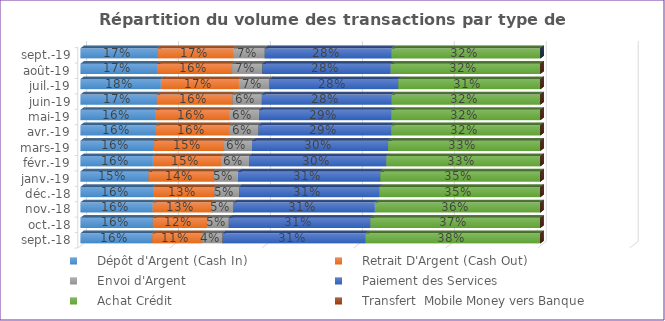
| Category |     Dépôt d'Argent (Cash In) |     Retrait D'Argent (Cash Out)  |     Envoi d'Argent  |     Réception d'Argent |     Paiement des Services |     Achat Crédit |     Transfert Banque vers Mobile Money |     Transfert  Mobile Money vers Banque  |
|---|---|---|---|---|---|---|---|---|
| 2018-09-01 | 0.156 | 0.109 | 0.044 | 0 | 0.311 | 0.379 | 0 | 0 |
| 2018-10-01 | 0.158 | 0.119 | 0.046 | 0 | 0.308 | 0.369 | 0 | 0 |
| 2018-11-01 | 0.157 | 0.129 | 0.047 | 0 | 0.307 | 0.359 | 0 | 0 |
| 2018-12-01 | 0.158 | 0.133 | 0.054 | 0 | 0.305 | 0.349 | 0 | 0 |
| 2019-01-01 | 0.148 | 0.141 | 0.054 | 0 | 0.31 | 0.348 | 0 | 0 |
| 2019-02-01 | 0.158 | 0.15 | 0.059 | 0 | 0.299 | 0.334 | 0 | 0 |
| 2019-03-01 | 0.159 | 0.153 | 0.061 | 0 | 0.296 | 0.331 | 0 | 0 |
| 2019-04-01 | 0.164 | 0.16 | 0.062 | 0 | 0.289 | 0.324 | 0 | 0 |
| 2019-05-01 | 0.164 | 0.161 | 0.063 | 0 | 0.288 | 0.323 | 0 | 0 |
| 2019-06-01 | 0.166 | 0.164 | 0.064 | 0 | 0.282 | 0.323 | 0 | 0 |
| 2019-07-01 | 0.175 | 0.17 | 0.067 | 0 | 0.28 | 0.309 | 0 | 0 |
| 2019-08-01 | 0.167 | 0.163 | 0.066 | 0 | 0.279 | 0.325 | 0 | 0 |
| 2019-09-01 | 0.168 | 0.166 | 0.067 | 0 | 0.276 | 0.323 | 0 | 0 |